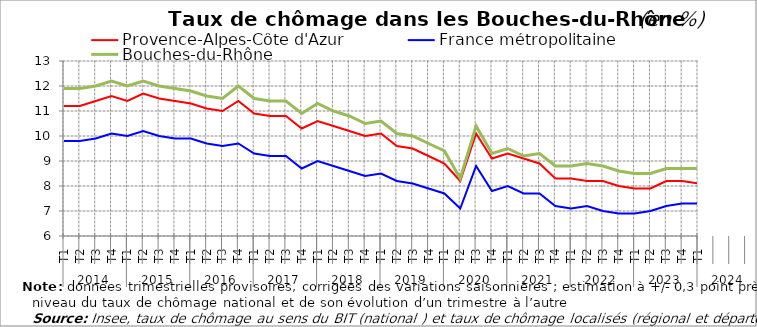
| Category | Provence-Alpes-Côte d'Azur | France métropolitaine | Bouches-du-Rhône |
|---|---|---|---|
| 0 | 11.2 | 9.8 | 11.9 |
| 1 | 11.2 | 9.8 | 11.9 |
| 2 | 11.4 | 9.9 | 12 |
| 3 | 11.6 | 10.1 | 12.2 |
| 4 | 11.4 | 10 | 12 |
| 5 | 11.7 | 10.2 | 12.2 |
| 6 | 11.5 | 10 | 12 |
| 7 | 11.4 | 9.9 | 11.9 |
| 8 | 11.3 | 9.9 | 11.8 |
| 9 | 11.1 | 9.7 | 11.6 |
| 10 | 11 | 9.6 | 11.5 |
| 11 | 11.4 | 9.7 | 12 |
| 12 | 10.9 | 9.3 | 11.5 |
| 13 | 10.8 | 9.2 | 11.4 |
| 14 | 10.8 | 9.2 | 11.4 |
| 15 | 10.3 | 8.7 | 10.9 |
| 16 | 10.6 | 9 | 11.3 |
| 17 | 10.4 | 8.8 | 11 |
| 18 | 10.2 | 8.6 | 10.8 |
| 19 | 10 | 8.4 | 10.5 |
| 20 | 10.1 | 8.5 | 10.6 |
| 21 | 9.6 | 8.2 | 10.1 |
| 22 | 9.5 | 8.1 | 10 |
| 23 | 9.2 | 7.9 | 9.7 |
| 24 | 8.9 | 7.7 | 9.4 |
| 25 | 8.2 | 7.1 | 8.3 |
| 26 | 10.1 | 8.8 | 10.4 |
| 27 | 9.1 | 7.8 | 9.3 |
| 28 | 9.3 | 8 | 9.5 |
| 29 | 9.1 | 7.7 | 9.2 |
| 30 | 8.9 | 7.7 | 9.3 |
| 31 | 8.3 | 7.2 | 8.8 |
| 32 | 8.3 | 7.1 | 8.8 |
| 33 | 8.2 | 7.2 | 8.9 |
| 34 | 8.2 | 7 | 8.8 |
| 35 | 8 | 6.9 | 8.6 |
| 36 | 7.9 | 6.9 | 8.5 |
| 37 | 7.9 | 7 | 8.5 |
| 38 | 8.2 | 7.2 | 8.7 |
| 39 | 8.2 | 7.3 | 8.7 |
| 40 | 8.1 | 7.3 | 8.7 |